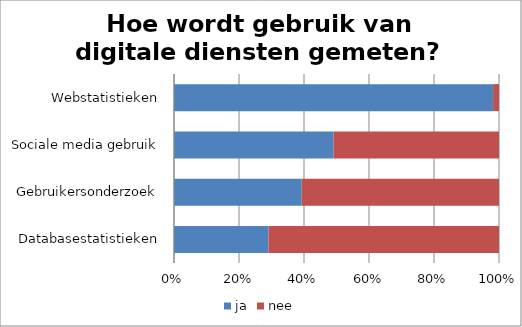
| Category | ja | nee |
|---|---|---|
| Databasestatistieken | 16 | 39 |
| Gebruikersonderzoek | 22 | 34 |
| Sociale media gebruik | 27 | 28 |
| Webstatistieken | 54 | 1 |